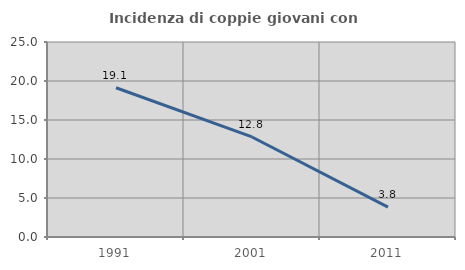
| Category | Incidenza di coppie giovani con figli |
|---|---|
| 1991.0 | 19.132 |
| 2001.0 | 12.826 |
| 2011.0 | 3.837 |